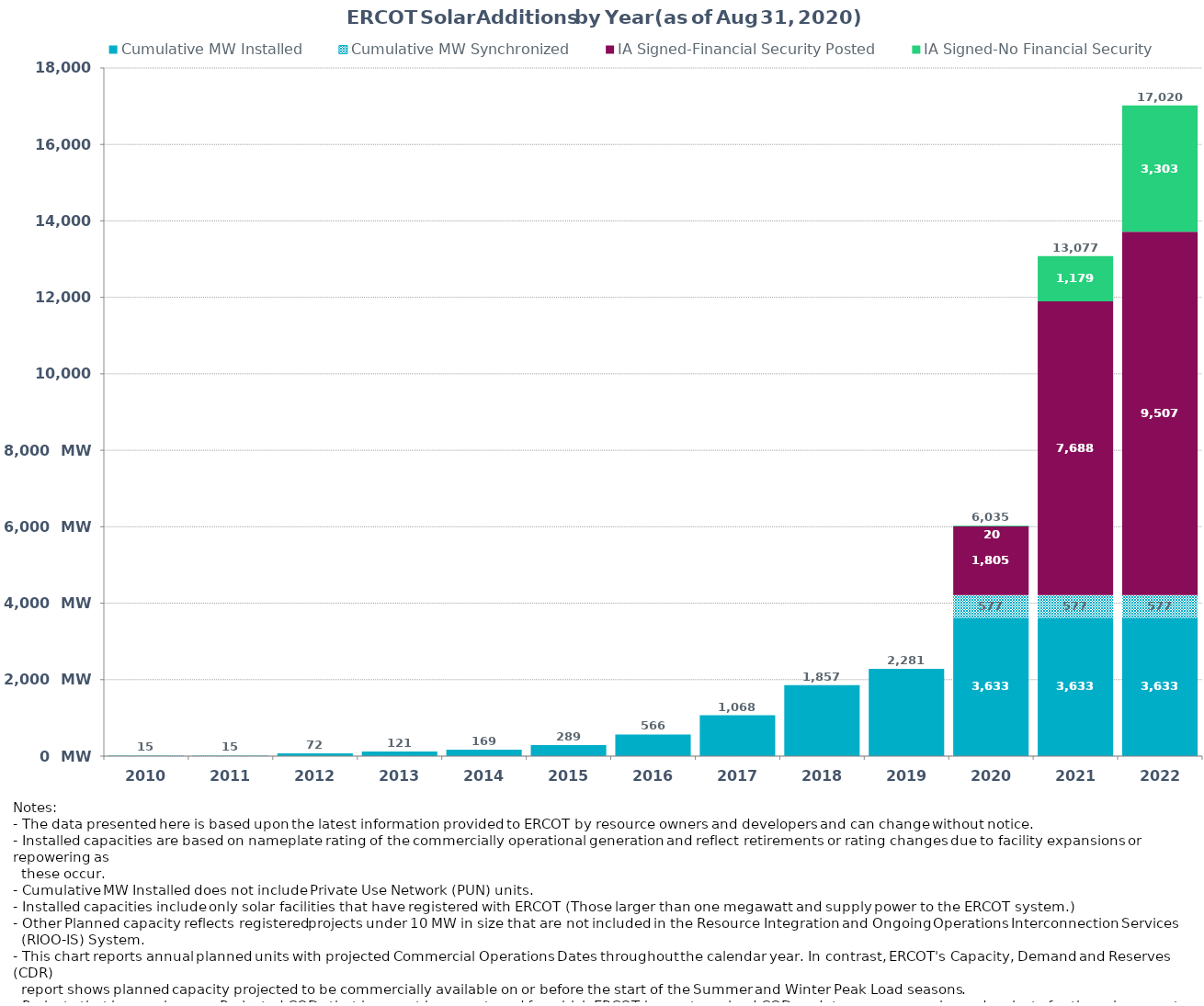
| Category | Cumulative MW Installed | Cumulative MW Synchronized | IA Signed-Financial Security Posted  | IA Signed-No Financial Security  | Other Planned | Cumulative Installed and Planned |
|---|---|---|---|---|---|---|
| 2010.0 | 15 | 0 | 0 | 0 | 0 | 15 |
| 2011.0 | 15 | 0 | 0 | 0 | 0 | 15 |
| 2012.0 | 72.3 | 0 | 0 | 0 | 0 | 72.3 |
| 2013.0 | 121.2 | 0 | 0 | 0 | 0 | 121.2 |
| 2014.0 | 168.7 | 0 | 0 | 0 | 0 | 168.7 |
| 2015.0 | 289.28 | 0 | 0 | 0 | 0 | 289.28 |
| 2016.0 | 565.78 | 0 | 0 | 0 | 0 | 565.78 |
| 2017.0 | 1067.78 | 0 | 0 | 0 | 0 | 1067.78 |
| 2018.0 | 1856.78 | 0 | 0 | 0 | 0 | 1856.78 |
| 2019.0 | 2281.38 | 0 | 0 | 0 | 0 | 2281.38 |
| 2020.0 | 3632.72 | 577 | 1805 | 20 | 0 | 6034.72 |
| 2021.0 | 3632.72 | 577 | 7688 | 1179 | 0 | 13076.72 |
| 2022.0 | 3632.72 | 577 | 9507.24 | 3302.98 | 0 | 17019.94 |